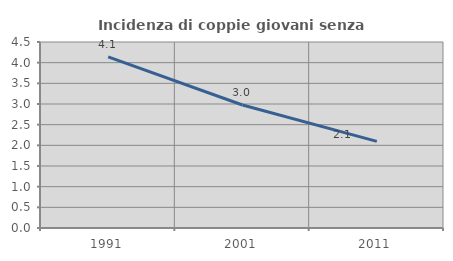
| Category | Incidenza di coppie giovani senza figli |
|---|---|
| 1991.0 | 4.139 |
| 2001.0 | 2.977 |
| 2011.0 | 2.096 |